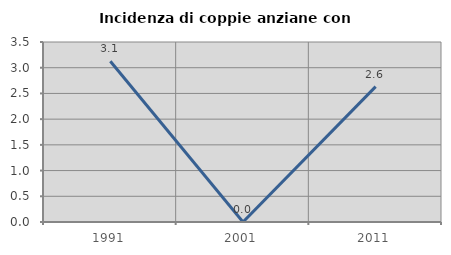
| Category | Incidenza di coppie anziane con figli |
|---|---|
| 1991.0 | 3.125 |
| 2001.0 | 0 |
| 2011.0 | 2.632 |